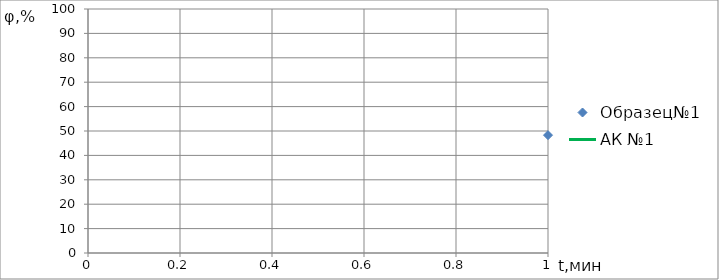
| Category | Образец№1 |
|---|---|
| 0 | 48.3 |
| 1 | 58.9 |
| 2 | 63.2 |
| 3 | 72 |
| 4 | 74.9 |
| 5 | 79.9 |
| 6 | 82.5 |
| 7 | 87.39 |
| 8 | 89.4 |
| 9 | 93 |
| 10 | 94.9 |
| 11 | 95.4 |
| 12 | 95.7 |
| 13 | 96.8 |
| 14 | 97.1 |
| 15 | 97.9 |
| 16 | 99.2 |
| 17 | 99.9 |